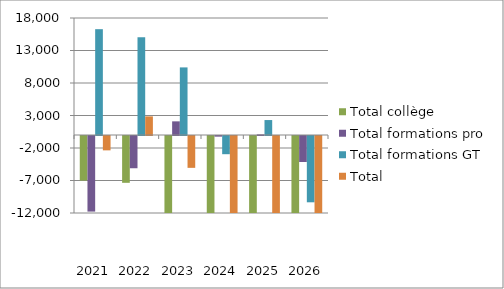
| Category | Total collège | Total formations pro | Total formations GT | Total |
|---|---|---|---|---|
| 2021.0 | -6859 | -11630 | 16280 | -2209 |
| 2022.0 | -7202 | -4961 | 15028 | 2865 |
| 2023.0 | -17400 | 2100 | 10400 | -4900 |
| 2024.0 | -20200 | -100 | -2800 | -23100 |
| 2025.0 | -26200 | 100 | 2300 | -23800 |
| 2026.0 | -27800 | -4000 | -10200 | -42000 |